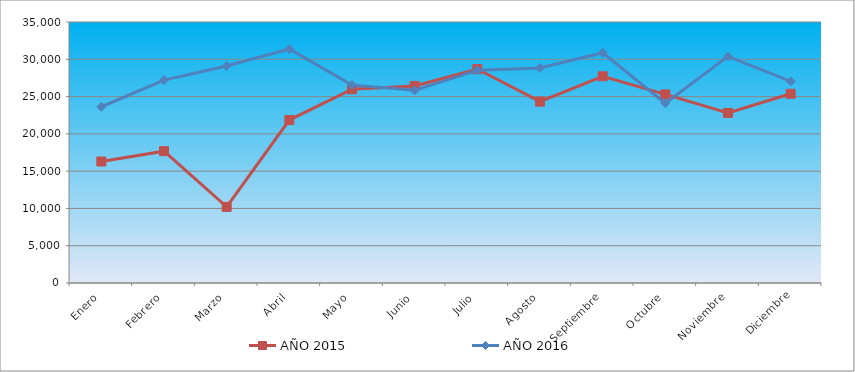
| Category | AÑO 2015 | AÑO 2016 |
|---|---|---|
| Enero | 16293.006 | 23635.033 |
| Febrero | 17680.941 | 27209.266 |
| Marzo | 10210.34 | 29096.985 |
| Abril | 21853.449 | 31387.408 |
| Mayo | 25980.553 | 26554.479 |
| Junio | 26425.623 | 25836.593 |
| Julio | 28691.876 | 28514.431 |
| Agosto | 24318.416 | 28838.293 |
| Septiembre | 27719.842 | 30877.086 |
| Octubre | 25289.703 | 24097.83 |
| Noviembre | 22801.22 | 30392.103 |
| Diciembre | 25375.003 | 27036.909 |